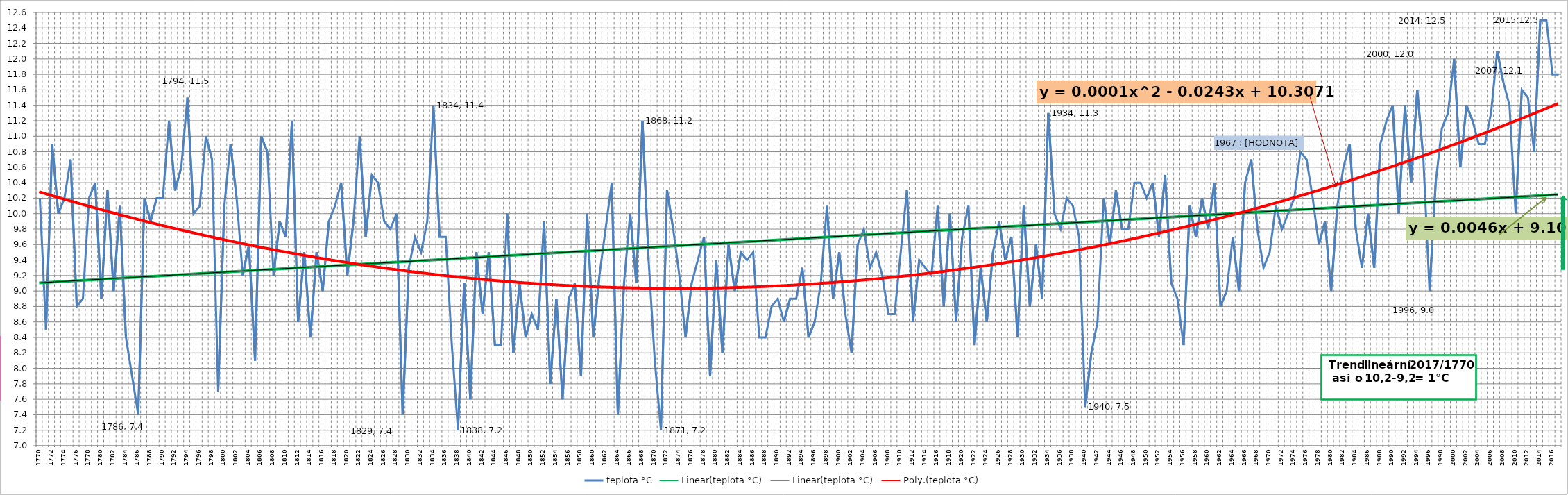
| Category | teplota °C |
|---|---|
| 1770 | 10.2 |
| 1771 | 8.5 |
| 1772 | 10.9 |
| 1773 | 10 |
| 1774 | 10.2 |
| 1775 | 10.7 |
| 1776 | 8.8 |
| 1777 | 8.9 |
| 1778 | 10.2 |
| 1779 | 10.4 |
| 1780 | 8.9 |
| 1781 | 10.3 |
| 1782 | 9 |
| 1783 | 10.1 |
| 1784 | 8.4 |
| 1785 | 7.9 |
| 1786 | 7.4 |
| 1787 | 10.2 |
| 1788 | 9.9 |
| 1789 | 10.2 |
| 1790 | 10.2 |
| 1791 | 11.2 |
| 1792 | 10.3 |
| 1793 | 10.6 |
| 1794 | 11.5 |
| 1795 | 10 |
| 1796 | 10.1 |
| 1797 | 11 |
| 1798 | 10.7 |
| 1799 | 7.7 |
| 1800 | 10.1 |
| 1801 | 10.9 |
| 1802 | 10.2 |
| 1803 | 9.2 |
| 1804 | 9.6 |
| 1805 | 8.1 |
| 1806 | 11 |
| 1807 | 10.8 |
| 1808 | 9.2 |
| 1809 | 9.9 |
| 1810 | 9.7 |
| 1811 | 11.2 |
| 1812 | 8.6 |
| 1813 | 9.5 |
| 1814 | 8.4 |
| 1815 | 9.5 |
| 1816 | 9 |
| 1817 | 9.9 |
| 1818 | 10.1 |
| 1819 | 10.4 |
| 1820 | 9.2 |
| 1821 | 9.9 |
| 1822 | 11 |
| 1823 | 9.7 |
| 1824 | 10.5 |
| 1825 | 10.4 |
| 1826 | 9.9 |
| 1827 | 9.8 |
| 1828 | 10 |
| 1829 | 7.4 |
| 1830 | 9.3 |
| 1831 | 9.7 |
| 1832 | 9.5 |
| 1833 | 9.9 |
| 1834 | 11.4 |
| 1835 | 9.7 |
| 1836 | 9.7 |
| 1837 | 8.3 |
| 1838 | 7.2 |
| 1839 | 9.1 |
| 1840 | 7.6 |
| 1841 | 9.5 |
| 1842 | 8.7 |
| 1843 | 9.5 |
| 1844 | 8.3 |
| 1845 | 8.3 |
| 1846 | 10 |
| 1847 | 8.2 |
| 1848 | 9.1 |
| 1849 | 8.4 |
| 1850 | 8.7 |
| 1851 | 8.5 |
| 1852 | 9.9 |
| 1853 | 7.8 |
| 1854 | 8.9 |
| 1855 | 7.6 |
| 1856 | 8.9 |
| 1857 | 9.1 |
| 1858 | 7.9 |
| 1859 | 10 |
| 1860 | 8.4 |
| 1861 | 9.2 |
| 1862 | 9.8 |
| 1863 | 10.4 |
| 1864 | 7.4 |
| 1865 | 9.1 |
| 1866 | 10 |
| 1867 | 9.1 |
| 1868 | 11.2 |
| 1869 | 9.4 |
| 1870 | 8.1 |
| 1871 | 7.2 |
| 1872 | 10.3 |
| 1873 | 9.8 |
| 1874 | 9.2 |
| 1875 | 8.4 |
| 1876 | 9.1 |
| 1877 | 9.4 |
| 1878 | 9.7 |
| 1879 | 7.9 |
| 1880 | 9.4 |
| 1881 | 8.2 |
| 1882 | 9.6 |
| 1883 | 9 |
| 1884 | 9.5 |
| 1885 | 9.4 |
| 1886 | 9.5 |
| 1887 | 8.4 |
| 1888 | 8.4 |
| 1889 | 8.8 |
| 1890 | 8.9 |
| 1891 | 8.6 |
| 1892 | 8.9 |
| 1893 | 8.9 |
| 1894 | 9.3 |
| 1895 | 8.4 |
| 1896 | 8.6 |
| 1897 | 9.1 |
| 1898 | 10.1 |
| 1899 | 8.9 |
| 1900 | 9.5 |
| 1901 | 8.7 |
| 1902 | 8.2 |
| 1903 | 9.6 |
| 1904 | 9.8 |
| 1905 | 9.3 |
| 1906 | 9.5 |
| 1907 | 9.2 |
| 1908 | 8.7 |
| 1909 | 8.7 |
| 1910 | 9.5 |
| 1911 | 10.3 |
| 1912 | 8.6 |
| 1913 | 9.4 |
| 1914 | 9.3 |
| 1915 | 9.2 |
| 1916 | 10.1 |
| 1917 | 8.8 |
| 1918 | 10 |
| 1919 | 8.6 |
| 1920 | 9.7 |
| 1921 | 10.1 |
| 1922 | 8.3 |
| 1923 | 9.3 |
| 1924 | 8.6 |
| 1925 | 9.5 |
| 1926 | 9.9 |
| 1927 | 9.4 |
| 1928 | 9.7 |
| 1929 | 8.4 |
| 1930 | 10.1 |
| 1931 | 8.8 |
| 1932 | 9.6 |
| 1933 | 8.9 |
| 1934 | 11.3 |
| 1935 | 10 |
| 1936 | 9.8 |
| 1937 | 10.2 |
| 1938 | 10.1 |
| 1939 | 9.7 |
| 1940 | 7.5 |
| 1941 | 8.2 |
| 1942 | 8.6 |
| 1943 | 10.2 |
| 1944 | 9.6 |
| 1945 | 10.3 |
| 1946 | 9.8 |
| 1947 | 9.8 |
| 1948 | 10.4 |
| 1949 | 10.4 |
| 1950 | 10.2 |
| 1951 | 10.4 |
| 1952 | 9.7 |
| 1953 | 10.5 |
| 1954 | 9.1 |
| 1955 | 8.9 |
| 1956 | 8.3 |
| 1957 | 10.1 |
| 1958 | 9.7 |
| 1959 | 10.2 |
| 1960 | 9.8 |
| 1961 | 10.4 |
| 1962 | 8.8 |
| 1963 | 9 |
| 1964 | 9.7 |
| 1965 | 9 |
| 1966 | 10.4 |
| 1967 | 10.7 |
| 1968 | 9.8 |
| 1969 | 9.3 |
| 1970 | 9.5 |
| 1971 | 10.1 |
| 1972 | 9.8 |
| 1973 | 10 |
| 1974 | 10.2 |
| 1975 | 10.8 |
| 1976 | 10.7 |
| 1977 | 10.2 |
| 1978 | 9.6 |
| 1979 | 9.9 |
| 1980 | 9 |
| 1981 | 10.1 |
| 1982 | 10.6 |
| 1983 | 10.9 |
| 1984 | 9.8 |
| 1985 | 9.3 |
| 1986 | 10 |
| 1987 | 9.3 |
| 1988 | 10.9 |
| 1989 | 11.2 |
| 1990 | 11.4 |
| 1991 | 10 |
| 1992 | 11.4 |
| 1993 | 10.4 |
| 1994 | 11.6 |
| 1995 | 10.7 |
| 1996 | 9 |
| 1997 | 10.4 |
| 1998 | 11.1 |
| 1999 | 11.3 |
| 2000 | 12 |
| 2001 | 10.6 |
| 2002 | 11.4 |
| 2003 | 11.2 |
| 2004 | 10.9 |
| 2005 | 10.9 |
| 2006 | 11.3 |
| 2007 | 12.1 |
| 2008 | 11.7 |
| 2009 | 11.4 |
| 2010 | 10 |
| 2011 | 11.6 |
| 2012 | 11.5 |
| 2013 | 10.8 |
| 2014 | 12.5 |
| 2015 | 12.5 |
| 2016 | 11.8 |
| 2017 | 11.8 |